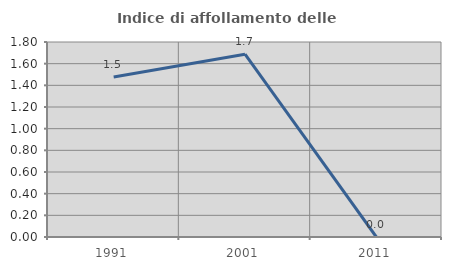
| Category | Indice di affollamento delle abitazioni  |
|---|---|
| 1991.0 | 1.478 |
| 2001.0 | 1.688 |
| 2011.0 | 0 |